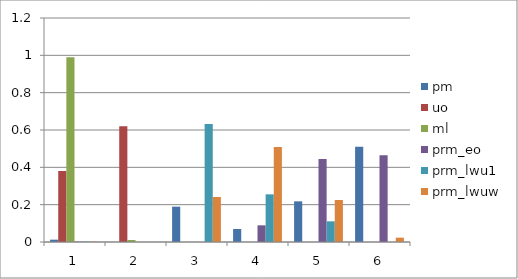
| Category | pm | uo | ml | prm_eo | prm_lwu1 | prm_lwuw |
|---|---|---|---|---|---|---|
| 1.0 | 0.012 | 0.38 | 0.989 | 0.002 | 0.002 | 0.002 |
| 2.0 | 0 | 0.62 | 0.011 | 0 | 0 | 0 |
| 3.0 | 0.189 | 0 | 0 | 0 | 0.632 | 0.241 |
| 4.0 | 0.07 | 0 | 0 | 0.089 | 0.255 | 0.509 |
| 5.0 | 0.218 | 0 | 0 | 0.445 | 0.111 | 0.225 |
| 6.0 | 0.511 | 0 | 0 | 0.464 | 0 | 0.023 |